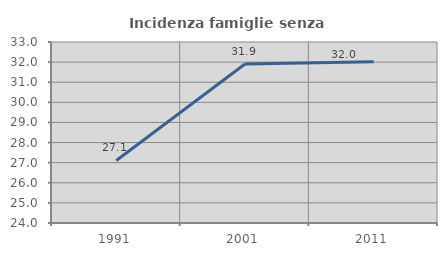
| Category | Incidenza famiglie senza nuclei |
|---|---|
| 1991.0 | 27.11 |
| 2001.0 | 31.91 |
| 2011.0 | 32.014 |